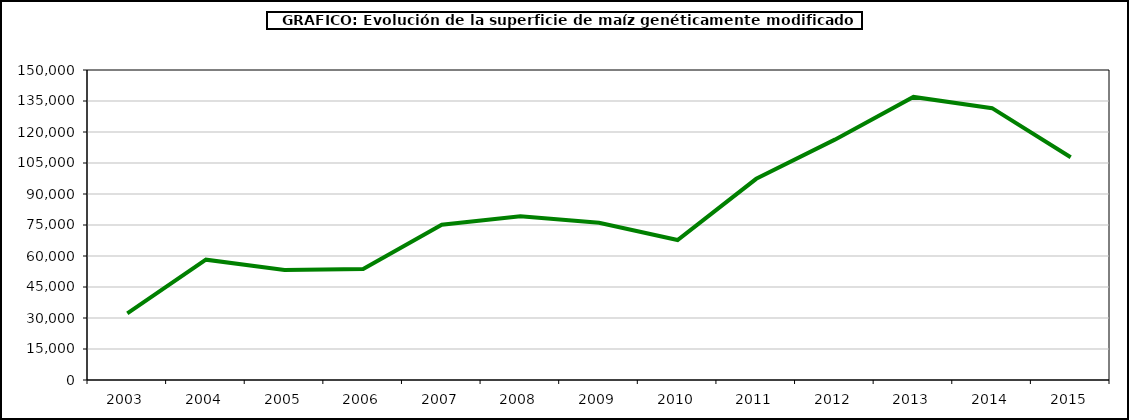
| Category | maiz |
|---|---|
| 2003 | 32249 |
| 2004 | 58219 |
| 2005 | 53226 |
| 2006 | 53667 |
| 2007 | 75148 |
| 2008 | 79269 |
| 2009 | 76057 |
| 2010 | 67726 |
| 2011 | 97346.31 |
| 2012 | 116306.6 |
| 2013 | 136962 |
| 2014 | 131537.67 |
| 2015 | 107749.22 |